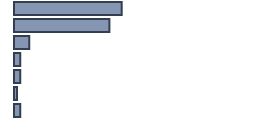
| Category | Percentatge |
|---|---|
| 0 | 44.872 |
| 1 | 39.744 |
| 2 | 6.4 |
| 3 | 2.6 |
| 4 | 2.564 |
| 5 | 1.282 |
| 6 | 2.564 |